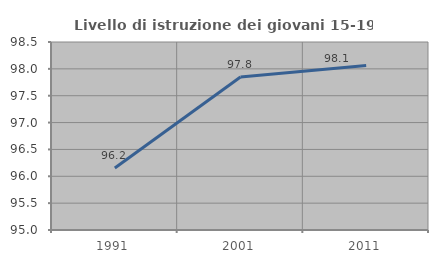
| Category | Livello di istruzione dei giovani 15-19 anni |
|---|---|
| 1991.0 | 96.154 |
| 2001.0 | 97.849 |
| 2011.0 | 98.061 |